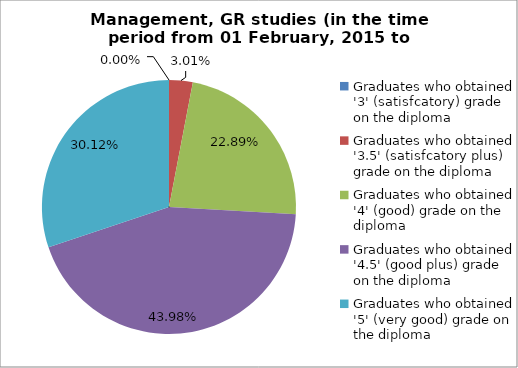
| Category | Series 0 |
|---|---|
| Graduates who obtained '3' (satisfcatory) grade on the diploma  | 0 |
| Graduates who obtained '3.5' (satisfcatory plus) grade on the diploma  | 3.012 |
| Graduates who obtained '4' (good) grade on the diploma  | 22.892 |
| Graduates who obtained '4.5' (good plus) grade on the diploma  | 43.976 |
| Graduates who obtained '5' (very good) grade on the diploma  | 30.12 |